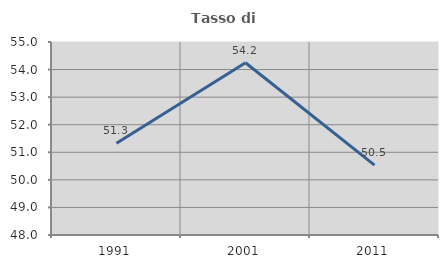
| Category | Tasso di occupazione   |
|---|---|
| 1991.0 | 51.331 |
| 2001.0 | 54.246 |
| 2011.0 | 50.537 |